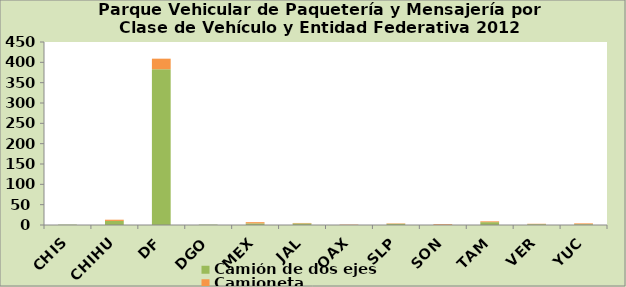
| Category | Camión de dos ejes | Camioneta |
|---|---|---|
| CHIS | 1 | 0 |
| CHIHU | 10 | 3 |
| DF | 383 | 26 |
| DGO | 1 | 0 |
| MEX | 4 | 3 |
| JAL | 4 | 1 |
| OAX | 0 | 1 |
| SLP | 3 | 1 |
| SON | 0 | 2 |
| TAM | 7 | 2 |
| VER | 2 | 1 |
| YUC | 2 | 2 |